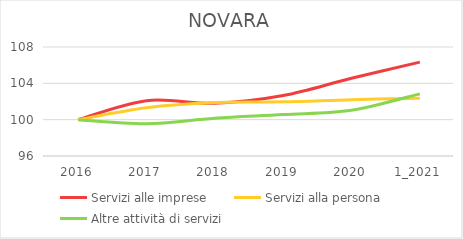
| Category | Servizi alle imprese | Servizi alla persona | Altre attività di servizi |
|---|---|---|---|
| 2016 | 100 | 100 | 100 |
| 2017 | 102.09 | 101.307 | 99.553 |
| 2018 | 101.805 | 101.879 | 100.165 |
| 2019 | 102.66 | 101.961 | 100.564 |
| 2020 | 104.56 | 102.206 | 101.034 |
| 1_2021 | 106.333 | 102.369 | 102.844 |